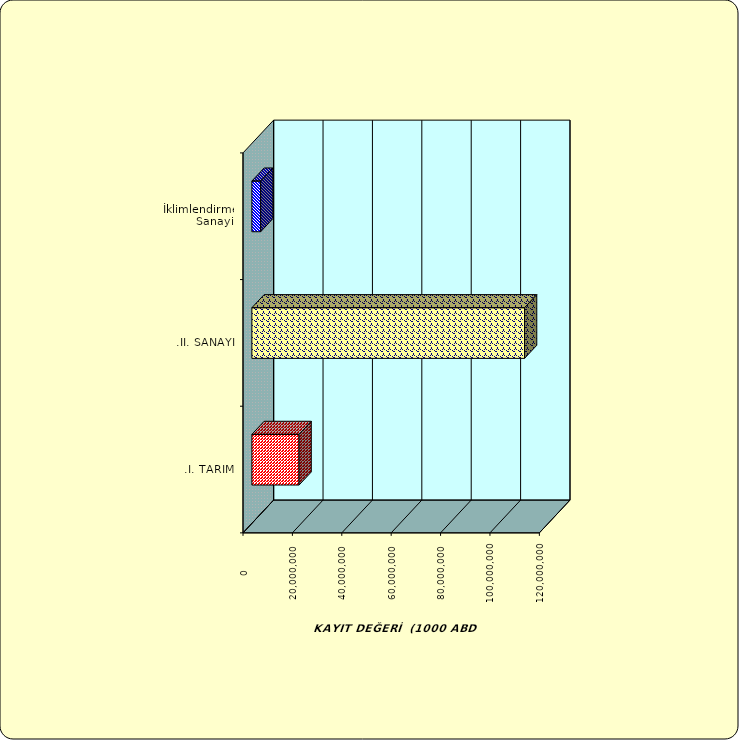
| Category | Series 0 |
|---|---|
| .I. TARIM | 19109228.555 |
| .II. SANAYİ | 110405169.278 |
|  İklimlendirme Sanayii | 3563551.014 |